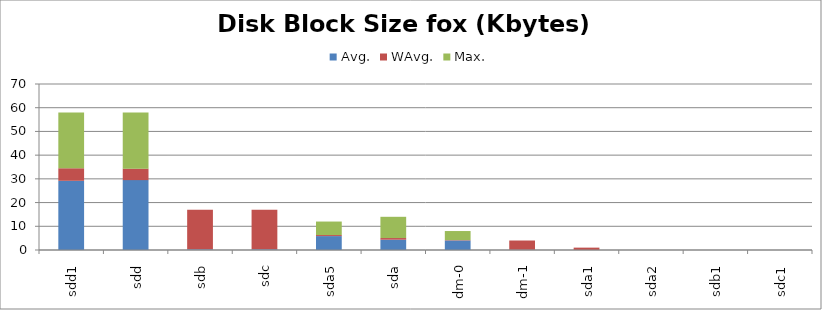
| Category | Avg. | WAvg. | Max. |
|---|---|---|---|
| sdd1 | 29.183 | 5.289 | 23.528 |
| sdd | 29.467 | 4.838 | 23.696 |
| sdb | 0.283 | 16.717 | 0 |
| sdc | 0.283 | 16.717 | 0 |
| sda5 | 5.867 | 0.44 | 5.693 |
| sda | 4.35 | 0.696 | 8.954 |
| dm-0 | 4.033 | 0.148 | 3.818 |
| dm-1 | 0.133 | 3.867 | 0 |
| sda1 | 0.017 | 0.983 | 0 |
| sda2 | 0 | 0 | 0 |
| sdb1 | 0 | 0 | 0 |
| sdc1 | 0 | 0 | 0 |